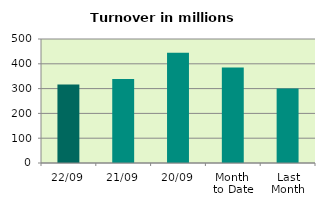
| Category | Series 0 |
|---|---|
| 22/09 | 316.041 |
| 21/09 | 338.363 |
| 20/09 | 444.532 |
| Month 
to Date | 385.083 |
| Last
Month | 300.77 |